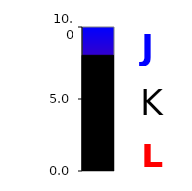
| Category | Series 0 |
|---|---|
| 0 | 8.034 |